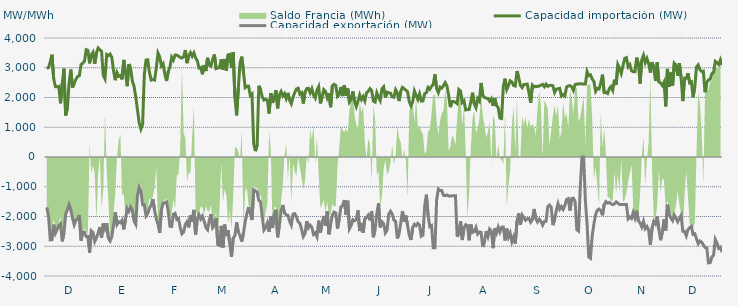
| Category | Capacidad importación (MW) | Capacidad exportación (MW) |
|---|---|---|
| 0 | 2973.125 | -1691.667 |
| 1900-01-01 | 3008.708 | -2006.25 |
| 1900-01-02 | 3198.417 | -2788.271 |
| 1900-01-03 | 3439.5 | -2780.875 |
| 1900-01-04 | 2626.625 | -2273 |
| 1900-01-05 | 2364.583 | -2564.167 |
| 1900-01-06 | 2360.417 | -2440.708 |
| 1900-01-07 | 2372.917 | -2302.125 |
| 1900-01-08 | 1804.167 | -2241.25 |
| 1900-01-09 | 2476.875 | -2836.292 |
| 1900-01-10 | 2972.208 | -2552.292 |
| 1900-01-11 | 1394.917 | -1922 |
| 1900-01-12 | 1635.417 | -1780.667 |
| 1900-01-13 | 2487.208 | -1602.083 |
| 1900-01-14 | 2938.333 | -1770.833 |
| 1900-01-15 | 2333.708 | -2058.75 |
| 1900-01-16 | 2480.333 | -2280.5 |
| 1900-01-17 | 2612.458 | -2120.333 |
| 1900-01-18 | 2705.792 | -2095.25 |
| 1900-01-19 | 2735.375 | -1951.833 |
| 1900-01-20 | 3100.375 | -2807.583 |
| 1900-01-21 | 3154.125 | -2514.417 |
| 1900-01-22 | 3216.042 | -2530.208 |
| 1900-01-23 | 3609.167 | -2672.875 |
| 1900-01-24 | 3585.958 | -2674.5 |
| 1900-01-25 | 3148.417 | -3214.25 |
| 1900-01-26 | 3433.542 | -2480.667 |
| 1900-01-27 | 3518.5 | -2539.5 |
| 1900-01-28 | 3130.292 | -2838.583 |
| 1900-01-29 | 3499.167 | -2718.417 |
| 1900-01-30 | 3663.042 | -2554.083 |
| 1900-01-31 | 3596.708 | -2355.75 |
| 1900-02-01 | 3562.792 | -2716.417 |
| 1900-02-02 | 2738.75 | -2235.333 |
| 1900-02-03 | 2625.667 | -2410 |
| 1900-02-04 | 3444.083 | -2226.333 |
| 1900-02-05 | 3408.75 | -2728 |
| 1900-02-06 | 3460.583 | -2820.25 |
| 1900-02-07 | 3350.75 | -2676.083 |
| 1900-02-08 | 2899.917 | -2289.583 |
| 1900-02-09 | 2581.708 | -1858.083 |
| 1900-02-10 | 2842.042 | -2272.417 |
| 1900-02-11 | 2711.125 | -2177.417 |
| 1900-02-12 | 2740.458 | -2209.667 |
| 1900-02-13 | 2608.583 | -2127.083 |
| 1900-02-14 | 3264.042 | -2433.083 |
| 1900-02-15 | 2836.375 | -2085.417 |
| 1900-02-16 | 2379.792 | -1727.083 |
| 1900-02-17 | 3123.25 | -1827.083 |
| 1900-02-18 | 2982.792 | -1681.25 |
| 1900-02-19 | 2556.667 | -1789.667 |
| 1900-02-20 | 2375.667 | -2149.333 |
| 1900-02-21 | 2017.208 | -2261.458 |
| 1900-02-22 | 1585 | -1297.917 |
| 1900-02-23 | 1154.167 | -1022.917 |
| 1900-02-24 | 939.583 | -1143.75 |
| 1900-02-25 | 1093.75 | -1604.167 |
| 1900-02-26 | 2763.333 | -1604.167 |
| 1900-02-27 | 3256.375 | -1980.875 |
| 1900-02-28 | 3265.958 | -1897.917 |
| 1900-02-28 | 2849.625 | -1726.333 |
| 1900-03-01 | 2586.542 | -1614.583 |
| 1900-03-02 | 2607.375 | -1416.667 |
| 1900-03-03 | 2587.208 | -1789.583 |
| 1900-03-04 | 2978.5 | -2081.25 |
| 1900-03-05 | 3497.083 | -2256.292 |
| 1900-03-06 | 3370 | -2554.542 |
| 1900-03-07 | 3061.75 | -1771.917 |
| 1900-03-08 | 3134.875 | -1562.5 |
| 1900-03-09 | 2789.5 | -1537.5 |
| 1900-03-10 | 2555.75 | -1512.5 |
| 1900-03-11 | 2867.083 | -1825 |
| 1900-03-12 | 3026.833 | -2326.458 |
| 1900-03-13 | 3354.833 | -2337.292 |
| 1900-03-14 | 3258.292 | -1924.167 |
| 1900-03-15 | 3426.125 | -1893.75 |
| 1900-03-16 | 3424.167 | -2100 |
| 1900-03-17 | 3391.208 | -2070.833 |
| 1900-03-18 | 3348.208 | -2362.208 |
| 1900-03-19 | 3325.958 | -2584.917 |
| 1900-03-20 | 3372.292 | -2526.125 |
| 1900-03-21 | 3594.458 | -2261.833 |
| 1900-03-22 | 3154.208 | -2177.542 |
| 1900-03-23 | 3406.542 | -2366 |
| 1900-03-24 | 3506.792 | -1962 |
| 1900-03-25 | 3388.292 | -2170.833 |
| 1900-03-26 | 3502.625 | -1778.917 |
| 1900-03-27 | 3329.875 | -2606.583 |
| 1900-03-28 | 3238.958 | -2081.917 |
| 1900-03-29 | 2990.542 | -1937.25 |
| 1900-03-30 | 3009.542 | -2084.208 |
| 1900-03-31 | 2780.333 | -1987.25 |
| 1900-04-01 | 3090.792 | -2157.25 |
| 1900-04-02 | 2889.375 | -2369.167 |
| 1900-04-03 | 3335.375 | -2443.917 |
| 1900-04-04 | 3086.625 | -2135.417 |
| 1900-04-05 | 3054 | -1916.417 |
| 1900-04-06 | 3285.417 | -2373 |
| 1900-04-07 | 3443.292 | -2289.333 |
| 1900-04-08 | 2971.208 | -2047.917 |
| 1900-04-09 | 2996.292 | -2944.458 |
| 1900-04-10 | 3001.167 | -2971.542 |
| 1900-04-11 | 3281.375 | -2314.833 |
| 1900-04-12 | 2936.042 | -3043.167 |
| 1900-04-13 | 3294.792 | -2270.333 |
| 1900-04-14 | 2907.375 | -2657.667 |
| 1900-04-15 | 3433.583 | -2462.5 |
| 1900-04-16 | 3449.042 | -2914.583 |
| 1900-04-17 | 2992.458 | -3358.458 |
| 1900-04-18 | 3524.375 | -2728.208 |
| 1900-04-19 | 2000 | -2643.375 |
| 1900-04-20 | 1400 | -2200 |
| 1900-04-21 | 2323.375 | -2514.75 |
| 1900-04-22 | 3160.167 | -2645.333 |
| 1900-04-23 | 3372.083 | -2842.167 |
| 1900-04-24 | 2865.739 | -2564.565 |
| 1900-04-25 | 2332.667 | -2181.833 |
| 1900-04-26 | 2376.083 | -1906.25 |
| 1900-04-27 | 2381.25 | -1683.333 |
| 1900-04-28 | 2070.833 | -1891.667 |
| 1900-04-29 | 2120.083 | -2118.75 |
| 1900-04-30 | 449.25 | -1108.333 |
| 1900-05-01 | 200 | -1139.583 |
| 1900-05-02 | 395.833 | -1179.167 |
| 1900-05-03 | 2393.75 | -1462.5 |
| 1900-05-04 | 2262.25 | -1512.5 |
| 1900-05-05 | 2020.833 | -2007.167 |
| 1900-05-06 | 1912.5 | -2455.208 |
| 1900-05-07 | 1939.583 | -2371.125 |
| 1900-05-08 | 1908.333 | -2217.958 |
| 1900-05-09 | 1462.5 | -2517.542 |
| 1900-05-10 | 2145.208 | -2000.417 |
| 1900-05-11 | 1820.833 | -2386.167 |
| 1900-05-12 | 1983.333 | -1930.75 |
| 1900-05-13 | 2245.833 | -1772.917 |
| 1900-05-14 | 1635.417 | -2697.5 |
| 1900-05-15 | 2079.167 | -2299.625 |
| 1900-05-16 | 2200 | -1818.75 |
| 1900-05-17 | 2052.083 | -1616.667 |
| 1900-05-18 | 2133.333 | -1885.417 |
| 1900-05-19 | 1962.5 | -1940.792 |
| 1900-05-20 | 2154.167 | -1955.875 |
| 1900-05-21 | 1906.25 | -2160.458 |
| 1900-05-22 | 1791.667 | -2289.583 |
| 1900-05-23 | 2014.583 | -1920.333 |
| 1900-05-24 | 2166.667 | -1904.167 |
| 1900-05-25 | 2285.417 | -2016.25 |
| 1900-05-26 | 2310.417 | -2177.917 |
| 1900-05-27 | 2114.583 | -2230.875 |
| 1900-05-28 | 2160.417 | -2431.625 |
| 1900-05-29 | 1797.917 | -2674.417 |
| 1900-05-30 | 2180.625 | -2574 |
| 1900-05-31 | 2300 | -2155.333 |
| 1900-06-01 | 2310.417 | -2380.708 |
| 1900-06-02 | 2160.417 | -2290.5 |
| 1900-06-03 | 2295.833 | -2360.958 |
| 1900-06-04 | 2083.333 | -2603 |
| 1900-06-05 | 1983.333 | -2551.458 |
| 1900-06-06 | 2243.75 | -2680.375 |
| 1900-06-07 | 2364.583 | -2139.583 |
| 1900-06-08 | 1802.083 | -2551.375 |
| 1900-06-09 | 2012.5 | -2222.583 |
| 1900-06-10 | 2264.583 | -1983.333 |
| 1900-06-11 | 2200 | -2304.167 |
| 1900-06-12 | 1991.667 | -1823 |
| 1900-06-13 | 2139.583 | -2598.667 |
| 1900-06-14 | 1674.583 | -2262.5 |
| 1900-06-15 | 2391.667 | -1958.333 |
| 1900-06-16 | 2442.875 | -1852.083 |
| 1900-06-17 | 2406.25 | -1879.167 |
| 1900-06-18 | 2035.417 | -2408.5 |
| 1900-06-19 | 2093.75 | -2077.083 |
| 1900-06-20 | 2353.042 | -1679.167 |
| 1900-06-21 | 2047.917 | -1637.5 |
| 1900-06-22 | 2414.917 | -1445.833 |
| 1900-06-23 | 2054.167 | -1935.417 |
| 1900-06-24 | 2304.167 | -1468.75 |
| 1900-06-25 | 1852.083 | -2413.583 |
| 1900-06-26 | 1950 | -2298.583 |
| 1900-06-27 | 2204.167 | -2108.333 |
| 1900-06-28 | 1870.833 | -2142.875 |
| 1900-06-29 | 1693.75 | -2094.083 |
| 1900-06-30 | 1875 | -1793.75 |
| 1900-07-01 | 2087.5 | -2489.25 |
| 1900-07-02 | 1929.167 | -2216.167 |
| 1900-07-03 | 2031.25 | -2542 |
| 1900-07-04 | 1885.417 | -2072.833 |
| 1900-07-05 | 2156.25 | -2029.167 |
| 1900-07-06 | 2208.333 | -1953 |
| 1900-07-07 | 2297.917 | -2127.083 |
| 1900-07-08 | 2229.167 | -1822.917 |
| 1900-07-09 | 1879.167 | -2695.583 |
| 1900-07-10 | 1845.833 | -2427.667 |
| 1900-07-11 | 2156.25 | -1908.417 |
| 1900-07-12 | 2010.417 | -1551.375 |
| 1900-07-13 | 1897.625 | -2367.333 |
| 1900-07-14 | 2291.667 | -2179.167 |
| 1900-07-15 | 2358.333 | -2236.833 |
| 1900-07-16 | 1997.917 | -2551.708 |
| 1900-07-17 | 2179.167 | -2457.875 |
| 1900-07-18 | 2156.25 | -1922.667 |
| 1900-07-19 | 2145.833 | -1823.917 |
| 1900-07-20 | 2022.917 | -1916.417 |
| 1900-07-21 | 2008.333 | -2121.167 |
| 1900-07-22 | 2260.417 | -2164.667 |
| 1900-07-23 | 2152.083 | -2739.958 |
| 1900-07-24 | 1881 | -2582.833 |
| 1900-07-25 | 2206.25 | -2222.083 |
| 1900-07-26 | 2339.583 | -1816.667 |
| 1900-07-27 | 2293.75 | -2177.833 |
| 1900-07-28 | 2245.833 | -1968.75 |
| 1900-07-29 | 2195.833 | -2304.458 |
| 1900-07-30 | 1858.208 | -2638.917 |
| 1900-07-31 | 1718.75 | -2788.083 |
| 1900-08-01 | 1858.333 | -2369.542 |
| 1900-08-02 | 2216.667 | -2260.583 |
| 1900-08-03 | 2066.667 | -2309.375 |
| 1900-08-04 | 1935.417 | -2231 |
| 1900-08-05 | 2118.292 | -2285.25 |
| 1900-08-06 | 1879.583 | -2663 |
| 1900-08-07 | 1887.5 | -2627.5 |
| 1900-08-08 | 2127.083 | -1647.917 |
| 1900-08-09 | 2162.5 | -1266.667 |
| 1900-08-10 | 2338.667 | -1964.583 |
| 1900-08-11 | 2277.083 | -2337.25 |
| 1900-08-12 | 2373.75 | -2304.167 |
| 1900-08-13 | 2435.083 | -3048.333 |
| 1900-08-14 | 2780.708 | -3048.208 |
| 1900-08-15 | 2300 | -1435 |
| 1900-08-16 | 2164.583 | -1077.083 |
| 1900-08-17 | 2350 | -1125 |
| 1900-08-18 | 2314.583 | -1125 |
| 1900-08-19 | 2395.625 | -1287.5 |
| 1900-08-20 | 2501.583 | -1302.083 |
| 1900-08-21 | 2389.417 | -1275 |
| 1900-08-22 | 2080.375 | -1308.333 |
| 1900-08-23 | 1675 | -1316.667 |
| 1900-08-24 | 1862.5 | -1300 |
| 1900-08-25 | 1866.708 | -1300 |
| 1900-08-26 | 1837.292 | -1300 |
| 1900-08-27 | 1793.75 | -2680.333 |
| 1900-08-28 | 2268.333 | -2563.75 |
| 1900-08-29 | 2217.333 | -2160.333 |
| 1900-08-30 | 1831.25 | -2791.75 |
| 1900-08-31 | 1890.083 | -2386.583 |
| 1900-09-01 | 1581.667 | -2273.25 |
| 1900-09-02 | 1595.833 | -2304.167 |
| 1900-09-03 | 1593.75 | -2799.042 |
| 1900-09-04 | 1860.75 | -2268.667 |
| 1900-09-05 | 2160.5 | -2533.875 |
| 1900-09-06 | 1785.417 | -2508.667 |
| 1900-09-07 | 1658.333 | -2368.167 |
| 1900-09-08 | 1958.333 | -2590.5 |
| 1900-09-09 | 1875.083 | -2522 |
| 1900-09-10 | 2489.792 | -2532.75 |
| 1900-09-11 | 2064.583 | -3024.833 |
| 1900-09-12 | 2001.333 | -2838.125 |
| 1900-09-13 | 1979.167 | -2490.417 |
| 1900-09-14 | 1966.667 | -2671.375 |
| 1900-09-15 | 1877.792 | -2424.333 |
| 1900-09-16 | 1957.75 | -2493.167 |
| 1900-09-17 | 1716.667 | -3063.708 |
| 1900-09-18 | 1978.5 | -2394.708 |
| 1900-09-19 | 1729.167 | -2549 |
| 1900-09-20 | 1666.667 | -2355.5 |
| 1900-09-21 | 1308.333 | -2520.458 |
| 1900-09-22 | 1293.75 | -2359.417 |
| 1900-09-23 | 2383.833 | -2353.167 |
| 1900-09-24 | 2632.25 | -2807.083 |
| 1900-09-25 | 2269.167 | -2407.042 |
| 1900-09-26 | 2400.75 | -2695.042 |
| 1900-09-27 | 2564.417 | -2553.583 |
| 1900-09-28 | 2525.583 | -2853.583 |
| 1900-09-29 | 2404.5 | -2690.292 |
| 1900-09-30 | 2386.042 | -2912.083 |
| 1900-10-01 | 2890.042 | -2155.708 |
| 1900-10-02 | 2668.625 | -1896.5 |
| 1900-10-03 | 2403.083 | -2272.75 |
| 1900-10-04 | 2332.833 | -1950 |
| 1900-10-05 | 2437.5 | -2037.5 |
| 1900-10-06 | 2441.667 | -2129 |
| 1900-10-07 | 2450 | -2079.167 |
| 1900-10-08 | 2159.292 | -2066.667 |
| 1900-10-09 | 1825 | -2195.667 |
| 1900-10-10 | 2412.5 | -2108.333 |
| 1900-10-11 | 2355.5 | -1747.917 |
| 1900-10-12 | 2377.083 | -2070.833 |
| 1900-10-13 | 2366.667 | -2185.333 |
| 1900-10-14 | 2387.5 | -2091.667 |
| 1900-10-15 | 2412.5 | -2164.583 |
| 1900-10-16 | 2443 | -2291.292 |
| 1900-10-17 | 2360.417 | -2168.75 |
| 1900-10-18 | 2450 | -2160.417 |
| 1900-10-19 | 2375 | -1668.75 |
| 1900-10-20 | 2402.083 | -1612.5 |
| 1900-10-21 | 2412 | -1683.333 |
| 1900-10-22 | 2393.75 | -2289.583 |
| 1900-10-23 | 2168.625 | -2114.083 |
| 1900-10-24 | 2281.25 | -1800 |
| 1900-10-25 | 2295.833 | -1566.667 |
| 1900-10-26 | 2306.25 | -1754.167 |
| 1900-10-27 | 2050 | -1662.5 |
| 1900-10-28 | 2100 | -1762.5 |
| 1900-10-29 | 2052.083 | -1629.167 |
| 1900-10-30 | 2351.708 | -1429.167 |
| 1900-10-31 | 2387.5 | -1400 |
| 1900-11-01 | 2400 | -1800 |
| 1900-11-02 | 2355.875 | -1400 |
| 1900-11-03 | 2239.583 | -1383.333 |
| 1900-11-04 | 2435.417 | -1500 |
| 1900-11-05 | 2450 | -2442.875 |
| 1900-11-06 | 2455.875 | -2487.042 |
| 1900-11-07 | 2459.792 | -1025 |
| 1900-11-08 | 2457.708 | 0 |
| 1900-11-09 | 2450 | 0 |
| 1900-11-10 | 2450 | -1462.5 |
| 1900-11-11 | 2870.833 | -2280.5 |
| 1900-11-12 | 2735.958 | -3362.458 |
| 1900-11-13 | 2761.833 | -3404.708 |
| 1900-11-14 | 2618.708 | -2638.958 |
| 1900-11-15 | 2538.583 | -2247.25 |
| 1900-11-16 | 2208.333 | -1933.333 |
| 1900-11-17 | 2304.167 | -1791.667 |
| 1900-11-18 | 2285.083 | -1750 |
| 1900-11-19 | 2485.708 | -1800 |
| 1900-11-20 | 2766.917 | -1958.333 |
| 1900-11-21 | 2164.458 | -1600 |
| 1900-11-22 | 2172.792 | -1500 |
| 1900-11-23 | 2133.333 | -1550 |
| 1900-11-24 | 2297.917 | -1525 |
| 1900-11-25 | 2366.667 | -1575 |
| 1900-11-26 | 2243.25 | -1600 |
| 1900-11-27 | 2598.52 | -1580 |
| 1900-11-28 | 2420.167 | -1508.333 |
| 1900-11-29 | 3106.25 | -1550 |
| 1900-11-30 | 2984.667 | -1600 |
| 1900-12-01 | 2812.083 | -1600 |
| 1900-12-02 | 3067.5 | -1600 |
| 1900-12-03 | 3316.25 | -1600 |
| 1900-12-04 | 3341.25 | -1600 |
| 1900-12-05 | 3032 | -2077.083 |
| 1900-12-06 | 3104.417 | -2016.75 |
| 1900-12-07 | 2900 | -2064.583 |
| 1900-12-08 | 2867 | -1862.5 |
| 1900-12-09 | 2867 | -2045.833 |
| 1900-12-10 | 3341.083 | -1804.167 |
| 1900-12-11 | 3131.083 | -2154.167 |
| 1900-12-12 | 2468.083 | -2216.667 |
| 1900-12-13 | 3265.167 | -2350 |
| 1900-12-14 | 3420.583 | -2164.833 |
| 1900-12-15 | 3174.333 | -2409.417 |
| 1900-12-16 | 3313.292 | -2335.75 |
| 1900-12-17 | 3146.333 | -2455.542 |
| 1900-12-18 | 2838 | -2955.75 |
| 1900-12-19 | 3188.5 | -2388.25 |
| 1900-12-20 | 2992.083 | -2162.5 |
| 1900-12-21 | 2556.125 | -2248.583 |
| 1900-12-22 | 3177.25 | -2002.917 |
| 1900-12-23 | 2521.083 | -2429.667 |
| 1900-12-24 | 2489.167 | -2797.208 |
| 1900-12-25 | 2404.583 | -2531.417 |
| 1900-12-26 | 2519.708 | -2094.75 |
| 1900-12-27 | 1700 | -2472.792 |
| 1900-12-28 | 2961.583 | -1602.083 |
| 1900-12-29 | 2367.125 | -1916.667 |
| 1900-12-30 | 2839.792 | -2043.75 |
| 1900-12-31 | 2395.833 | -2137.5 |
| 1901-01-01 | 3152.583 | -1952.083 |
| 1901-01-02 | 3090.75 | -2052.083 |
| 1901-01-03 | 2732.167 | -2177.083 |
| 1901-01-04 | 3154.208 | -2069.625 |
| 1901-01-05 | 2672.375 | -1960.417 |
| 1901-01-06 | 1879.167 | -2497 |
| 1901-01-07 | 2643.583 | -2497 |
| 1901-01-08 | 2643.083 | -2647.583 |
| 1901-01-09 | 2816.917 | -2441.083 |
| 1901-01-10 | 2493.125 | -2374 |
| 1901-01-11 | 2524.458 | -2332.167 |
| 1901-01-12 | 2008.333 | -2601 |
| 1901-01-13 | 2361.875 | -2582.083 |
| 1901-01-14 | 3027.625 | -2755.833 |
| 1901-01-15 | 3096.375 | -2911.667 |
| 1901-01-16 | 2940.417 | -2822.917 |
| 1901-01-17 | 2875 | -2863.5 |
| 1901-01-18 | 2886.833 | -2951.167 |
| 1901-01-19 | 2177.083 | -3040.5 |
| 1901-01-20 | 2503.583 | -3052 |
| 1901-01-21 | 2591.792 | -3558.75 |
| 1901-01-22 | 2617 | -3551.083 |
| 1901-01-23 | 2801.958 | -3364.542 |
| 1901-01-24 | 2846.25 | -3293 |
| 1901-01-25 | 3214.542 | -2770.875 |
| 1901-01-26 | 3169.167 | -2897.917 |
| 1901-01-27 | 3108.042 | -3073.375 |
| 1901-01-28 | 3266.042 | -3032.75 |
| 1901-01-29 | 3083.708 | -3200.292 |